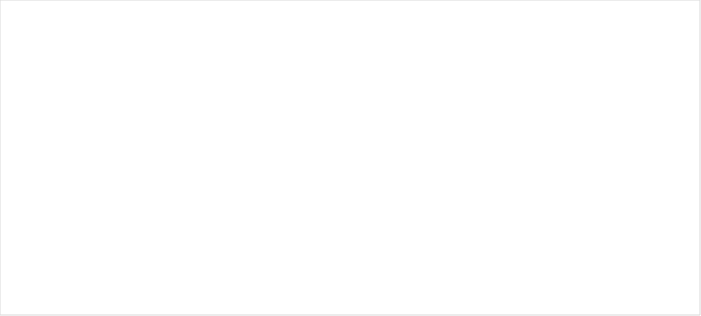
| Category | Average of  
Implied Return | Average of Alpha |
|---|---|---|
| Medium Market Cap | 0.022 | -0.012 |
| Bottom Market Cap | 0.01 | -0.024 |
| Top Market Cap | 0.02 | -0.017 |